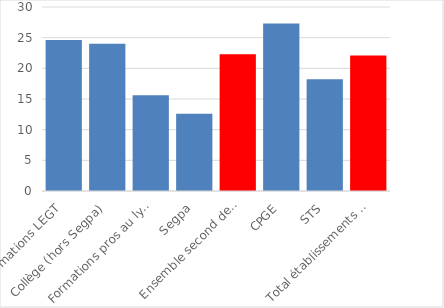
| Category | 2021 |
|---|---|
| Formations LEGT | 24.6 |
| Collège (hors Segpa) | 24 |
| Formations pros au lycée | 15.6 |
| Segpa | 12.6 |
| Ensemble second degré | 22.3 |
| CPGE | 27.3 |
| STS | 18.2 |
| Total établissements du second degré | 22.1 |